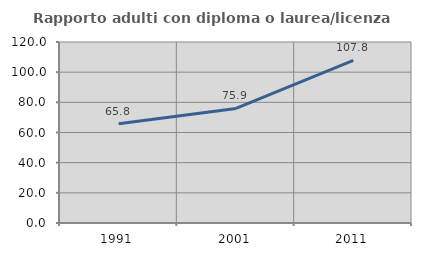
| Category | Rapporto adulti con diploma o laurea/licenza media  |
|---|---|
| 1991.0 | 65.774 |
| 2001.0 | 75.944 |
| 2011.0 | 107.8 |